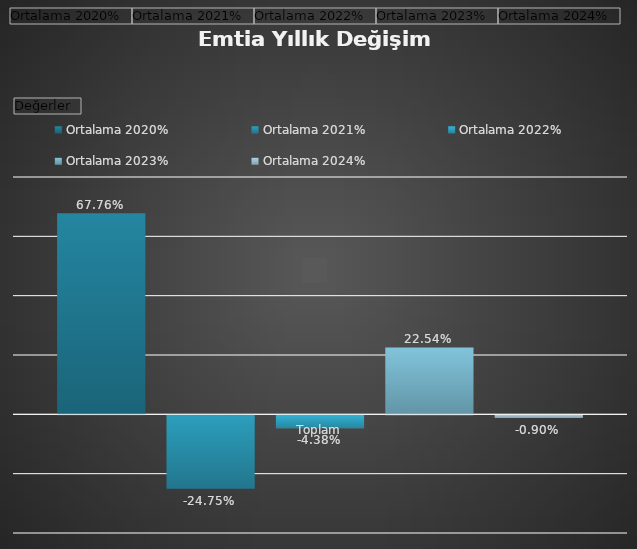
| Category | Ortalama 2020% | Ortalama 2021% | Ortalama 2022% | Ortalama 2023% | Ortalama 2024% |
|---|---|---|---|---|---|
| Toplam | 0.678 | -0.248 | -0.044 | 0.225 | -0.009 |